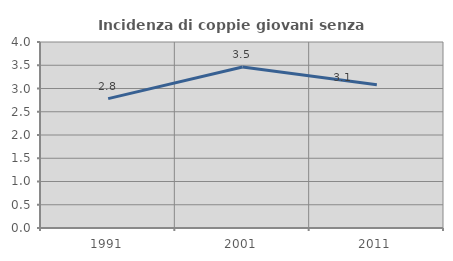
| Category | Incidenza di coppie giovani senza figli |
|---|---|
| 1991.0 | 2.783 |
| 2001.0 | 3.461 |
| 2011.0 | 3.083 |